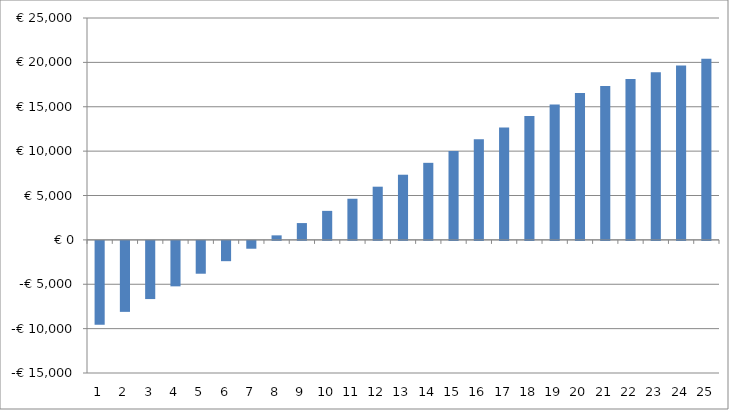
| Category | Series 0 |
|---|---|
| 0 | -5288 |
| 1 | -5109.888 |
| 2 | -4935.629 |
| 3 | -4765.188 |
| 4 | -4598.532 |
| 5 | -4435.625 |
| 6 | -4276.434 |
| 7 | -4120.926 |
| 8 | -3969.068 |
| 9 | -3820.826 |
| 10 | -3676.169 |
| 11 | -3535.063 |
| 12 | -3397.478 |
| 13 | -3263.381 |
| 14 | -3132.74 |
| 15 | -3005.525 |
| 16 | -2881.706 |
| 17 | -2761.25 |
| 18 | -2644.129 |
| 19 | -2530.312 |
| 20 | -2419.769 |
| 21 | -2312.471 |
| 22 | -2208.389 |
| 23 | -2107.494 |
| 24 | -2009.756 |